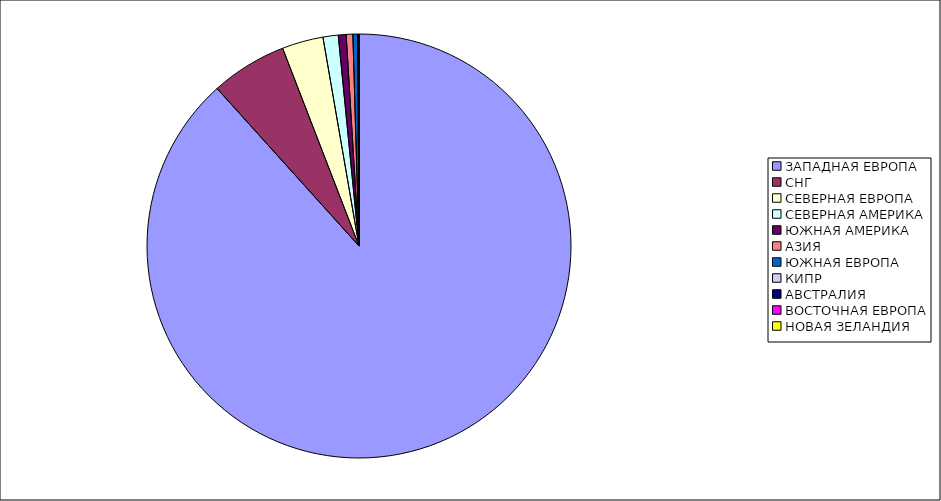
| Category | Оборот |
|---|---|
| ЗАПАДНАЯ ЕВРОПА | 0.883 |
| СНГ | 0.058 |
| СЕВЕРНАЯ ЕВРОПА | 0.031 |
| СЕВЕРНАЯ АМЕРИКА | 0.012 |
| ЮЖНАЯ АМЕРИКА | 0.006 |
| АЗИЯ | 0.005 |
| ЮЖНАЯ ЕВРОПА | 0.004 |
| КИПР | 0.001 |
| АВСТРАЛИЯ | 0 |
| ВОСТОЧНАЯ ЕВРОПА | 0 |
| НОВАЯ ЗЕЛАНДИЯ | 0 |